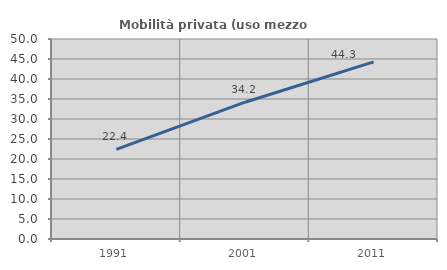
| Category | Mobilità privata (uso mezzo privato) |
|---|---|
| 1991.0 | 22.414 |
| 2001.0 | 34.201 |
| 2011.0 | 44.28 |